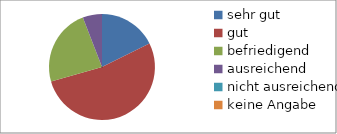
| Category | Series 0 |
|---|---|
| sehr gut | 3 |
| gut | 9 |
| befriedigend | 4 |
| ausreichend | 1 |
| nicht ausreichend | 0 |
| keine Angabe | 0 |